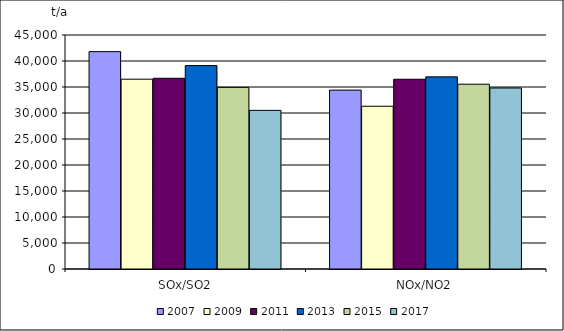
| Category | 2007 | 2009 | 2011 | 2013 | 2015 | 2017 |
|---|---|---|---|---|---|---|
| SOx/SO2 | 41800 | 36500 | 36674 | 39120 | 34928 | 30508 |
| NOx/NO2 | 34400 | 31300 | 36489 | 36949 | 35539 | 34808 |